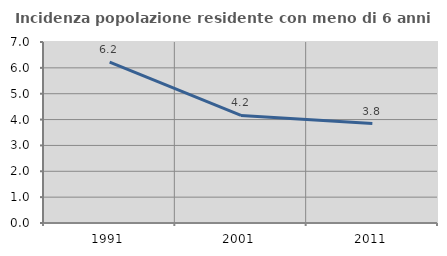
| Category | Incidenza popolazione residente con meno di 6 anni |
|---|---|
| 1991.0 | 6.224 |
| 2001.0 | 4.161 |
| 2011.0 | 3.845 |